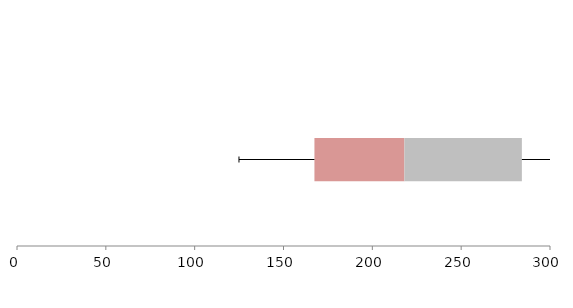
| Category | Series 1 | Series 2 | Series 3 |
|---|---|---|---|
| 0 | 167.411 | 50.633 | 66.13 |